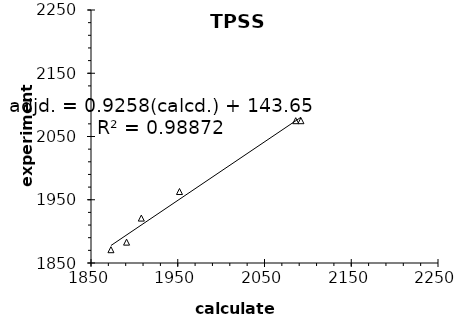
| Category | BP86 |
|---|---|
| 1873.0 | 1871 |
| 1891.0 | 1883 |
| 1908.0 | 1921 |
| 1952.0 | 1963 |
| 2086.0 | 2075 |
| 2092.0 | 2075 |